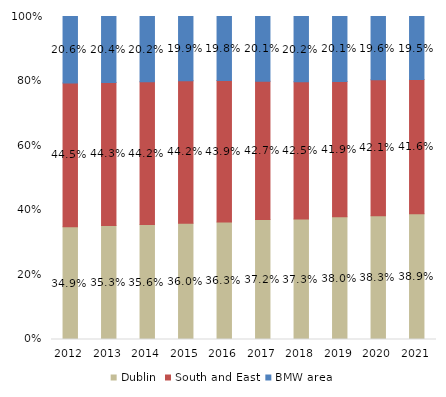
| Category | Dublin | South and East | BMW area |
|---|---|---|---|
| 2012.0 | 0.349 | 0.445 | 0.206 |
| 2013.0 | 0.353 | 0.443 | 0.204 |
| 2014.0 | 0.356 | 0.442 | 0.202 |
| 2015.0 | 0.36 | 0.442 | 0.199 |
| 2016.0 | 0.363 | 0.439 | 0.198 |
| 2017.0 | 0.372 | 0.427 | 0.201 |
| 2018.0 | 0.373 | 0.425 | 0.202 |
| 2019.0 | 0.38 | 0.419 | 0.201 |
| 2020.0 | 0.383 | 0.421 | 0.196 |
| 2021.0 | 0.389 | 0.416 | 0.195 |